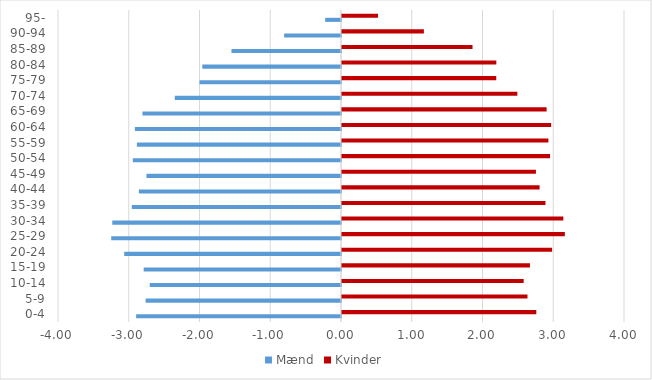
| Category | Mænd | Kvinder |
|---|---|---|
| 0-4 | -2.896 | 2.746 |
| 5-9 | -2.762 | 2.622 |
| 10-14 | -2.703 | 2.568 |
| 15-19 | -2.789 | 2.656 |
| 20-24 | -3.064 | 2.97 |
| 25-29 | -3.248 | 3.15 |
| 30-34 | -3.233 | 3.129 |
| 35-39 | -2.957 | 2.876 |
| 40-44 | -2.857 | 2.793 |
| 45-49 | -2.75 | 2.741 |
| 50-54 | -2.943 | 2.941 |
| 55-59 | -2.885 | 2.917 |
| 60-64 | -2.913 | 2.956 |
| 65-69 | -2.807 | 2.892 |
| 70-74 | -2.349 | 2.478 |
| 75-79 | -2 | 2.18 |
| 80-84 | -1.96 | 2.181 |
| 85-89 | -1.548 | 1.845 |
| 90-94 | -0.804 | 1.157 |
| 95- | -0.224 | 0.51 |